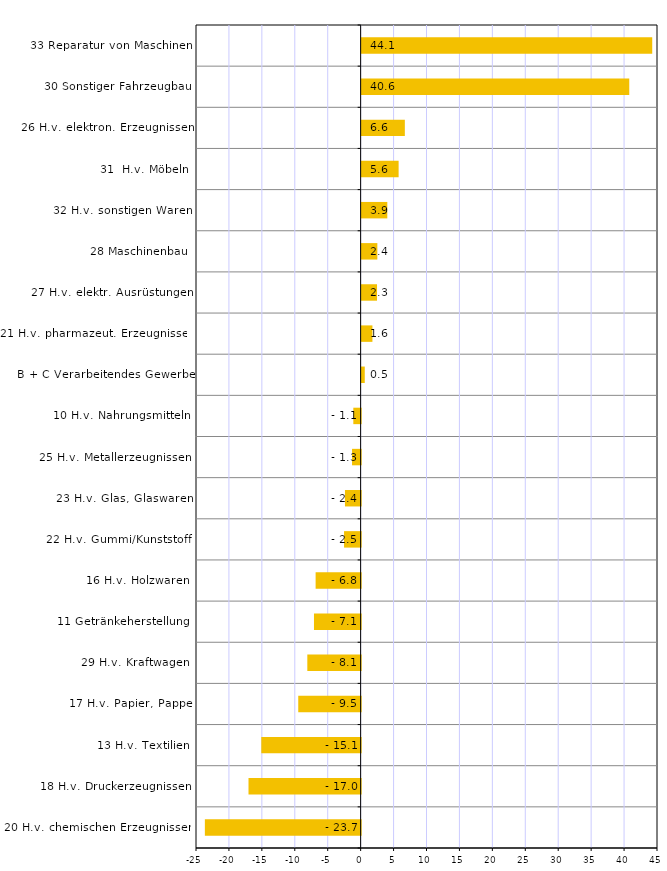
| Category | Series 0 |
|---|---|
| 20 H.v. chemischen Erzeugnissen | -23.654 |
| 18 H.v. Druckerzeugnissen | -17.027 |
| 13 H.v. Textilien | -15.086 |
| 17 H.v. Papier, Pappe | -9.474 |
| 29 H.v. Kraftwagen | -8.097 |
| 11 Getränkeherstellung | -7.085 |
| 16 H.v. Holzwaren | -6.837 |
| 22 H.v. Gummi/Kunststoff | -2.52 |
| 23 H.v. Glas, Glaswaren | -2.381 |
| 25 H.v. Metallerzeugnissen | -1.307 |
| 10 H.v. Nahrungsmitteln | -1.112 |
| B + C Verarbeitendes Gewerbe | 0.473 |
| 21 H.v. pharmazeut. Erzeugnissen | 1.637 |
| 27 H.v. elektr. Ausrüstungen | 2.337 |
| 28 Maschinenbau | 2.384 |
| 32 H.v. sonstigen Waren | 3.896 |
| 31  H.v. Möbeln | 5.615 |
| 26 H.v. elektron. Erzeugnissen | 6.56 |
| 30 Sonstiger Fahrzeugbau | 40.637 |
| 33 Reparatur von Maschinen | 44.124 |